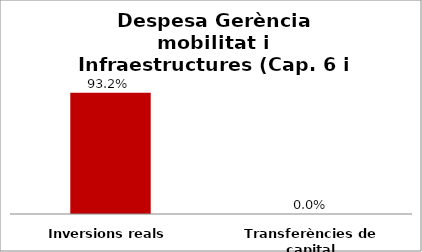
| Category | Series 0 |
|---|---|
| Inversions reals | 0.932 |
| Transferències de capital | 0 |